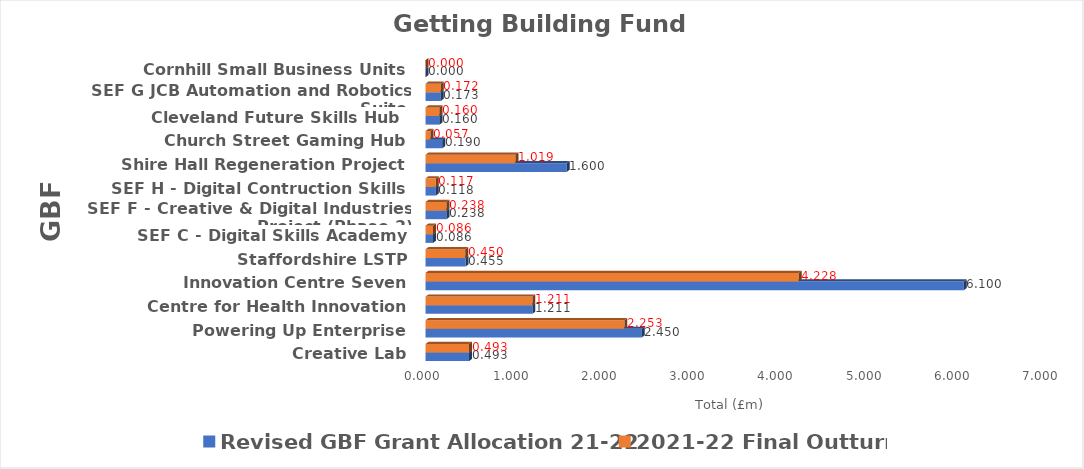
| Category | Revised GBF Grant Allocation 21-22 | 2021-22 Final Outturn |
|---|---|---|
| Creative Lab | 0.493 | 0.493 |
| Powering Up Enterprise | 2.45 | 2.253 |
| Centre for Health Innovation | 1.211 | 1.211 |
| Innovation Centre Seven | 6.1 | 4.228 |
| Staffordshire LSTP | 0.455 | 0.45 |
| SEF C - Digital Skills Academy | 0.086 | 0.086 |
| SEF F - Creative & Digital Industries Project (Phase 2) | 0.238 | 0.238 |
| SEF H - Digital Contruction Skills | 0.118 | 0.117 |
| Shire Hall Regeneration Project | 1.6 | 1.019 |
| Church Street Gaming Hub | 0.19 | 0.057 |
| Cleveland Future Skills Hub  | 0.16 | 0.16 |
| SEF G JCB Automation and Robotics Suite  | 0.173 | 0.172 |
| Cornhill Small Business Units | 0 | 0 |